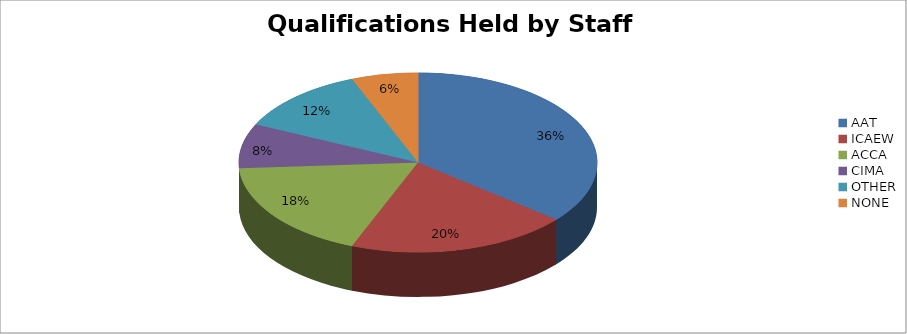
| Category | Series 0 | Series 1 |
|---|---|---|
| AAT | 18 |  |
| ICAEW | 10 |  |
| ACCA | 9 |  |
| CIMA | 4 |  |
| OTHER | 6 |  |
| NONE | 3 |  |